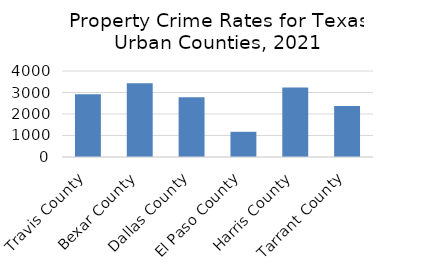
| Category | 2021 |
|---|---|
| Travis County | 2915.474 |
| Bexar County | 3428.456 |
| Dallas County | 2776.822 |
| El Paso County | 1172.17 |
| Harris County | 3233.851 |
| Tarrant County | 2367.706 |